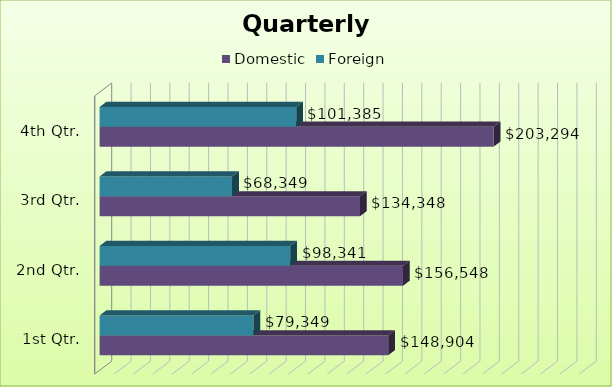
| Category | Domestic | Foreign |
|---|---|---|
| 1st Qtr. | 148904 | 79349 |
| 2nd Qtr. | 156548 | 98341 |
| 3rd Qtr. | 134348 | 68349 |
| 4th Qtr. | 203294 | 101385 |